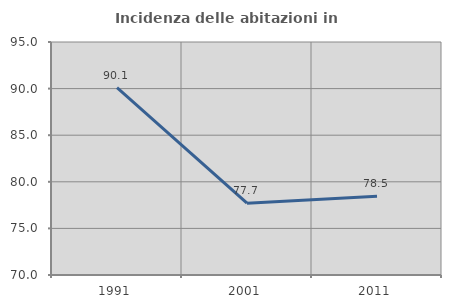
| Category | Incidenza delle abitazioni in proprietà  |
|---|---|
| 1991.0 | 90.116 |
| 2001.0 | 77.711 |
| 2011.0 | 78.457 |